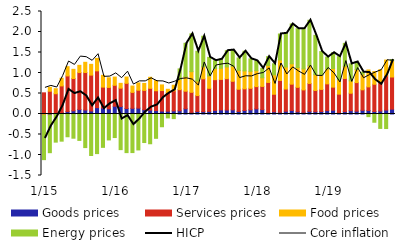
| Category | Goods prices | Services prices | Food prices | Energy prices |
|---|---|---|---|---|
|  1/15 | -0.019 | 0.516 | -0.016 | -1.079 |
| 2 | -0.027 | 0.556 | 0.095 | -0.917 |
| 3 | -0.003 | 0.494 | 0.122 | -0.684 |
| 4 | 0.037 | 0.649 | 0.186 | -0.662 |
| 5 | 0.058 | 0.871 | 0.226 | -0.555 |
| 6 | 0.079 | 0.787 | 0.224 | -0.591 |
| 7 | 0.111 | 0.9 | 0.176 | -0.644 |
| 8 | 0.098 | 0.915 | 0.249 | -0.819 |
| 9 | 0.074 | 0.875 | 0.263 | -1.012 |
| 10 | 0.155 | 0.898 | 0.303 | -0.966 |
| 11 | 0.147 | 0.509 | 0.287 | -0.813 |
| 12 | 0.126 | 0.522 | 0.234 | -0.632 |
|  1/16 | 0.19 | 0.51 | 0.2 | -0.574 |
| 2 | 0.183 | 0.447 | 0.117 | -0.869 |
| 3 | 0.134 | 0.614 | 0.153 | -0.942 |
| 4 | 0.139 | 0.389 | 0.155 | -0.941 |
| 5 | 0.144 | 0.436 | 0.178 | -0.876 |
| 6 | 0.104 | 0.471 | 0.17 | -0.696 |
| 7 | 0.095 | 0.532 | 0.269 | -0.726 |
| 8 | 0.084 | 0.483 | 0.245 | -0.593 |
| 9 | 0.071 | 0.502 | 0.137 | -0.311 |
| 10 | 0.068 | 0.458 | 0.076 | -0.095 |
| 11 | 0.076 | 0.489 | 0.138 | -0.112 |
| 12 | 0.079 | 0.515 | 0.246 | 0.26 |
|  1/17 | 0.128 | 0.428 | 0.357 | 0.811 |
| 2 | 0.04 | 0.489 | 0.504 | 0.922 |
| 3 | 0.06 | 0.389 | 0.354 | 0.727 |
| 4 | 0.058 | 0.801 | 0.292 | 0.745 |
| 5 | 0.063 | 0.564 | 0.301 | 0.454 |
| 6 | 0.089 | 0.749 | 0.273 | 0.189 |
| 7 | 0.1 | 0.744 | 0.271 | 0.222 |
| 8 | 0.097 | 0.765 | 0.286 | 0.396 |
| 9 | 0.102 | 0.696 | 0.365 | 0.396 |
| 10 | 0.062 | 0.541 | 0.46 | 0.304 |
| 11 | 0.086 | 0.528 | 0.438 | 0.479 |
| 12 | 0.101 | 0.525 | 0.414 | 0.304 |
|  1/18 | 0.126 | 0.543 | 0.39 | 0.238 |
| 2 | 0.107 | 0.566 | 0.211 | 0.229 |
| 3 | 0.034 | 0.736 | 0.415 | 0.215 |
| 4 | 0.054 | 0.428 | 0.474 | 0.269 |
| 5 | 0.044 | 0.775 | 0.499 | 0.633 |
| 6 | 0.067 | 0.543 | 0.537 | 0.822 |
| 7 | 0.088 | 0.64 | 0.497 | 0.97 |
| 8 | 0.054 | 0.597 | 0.48 | 0.949 |
| 9 | 0.041 | 0.547 | 0.511 | 0.983 |
| 10 | 0.064 | 0.681 | 0.428 | 1.113 |
| 11 | 0.057 | 0.518 | 0.385 | 0.959 |
| 12 | 0.062 | 0.538 | 0.349 | 0.573 |
|  1/19 | 0.083 | 0.652 | 0.366 | 0.287 |
| 2 | 0.093 | 0.562 | 0.456 | 0.382 |
| 3 | 0.036 | 0.448 | 0.353 | 0.562 |
| 4 | 0.059 | 0.808 | 0.301 | 0.555 |
| 5 | 0.081 | 0.426 | 0.303 | 0.412 |
| 6 | 0.068 | 0.698 | 0.317 | 0.184 |
| 7 | 0.091 | 0.499 | 0.381 | 0.05 |
| 8 | 0.086 | 0.576 | 0.412 | -0.064 |
| 9 | 0.06 | 0.665 | 0.309 | -0.201 |
| 10 | 0.073 | 0.702 | 0.302 | -0.352 |
| 11 | 0.096 | 0.836 | 0.383 | -0.355 |
| 12 | 0.119 | 0.784 | 0.401 | 0.023 |